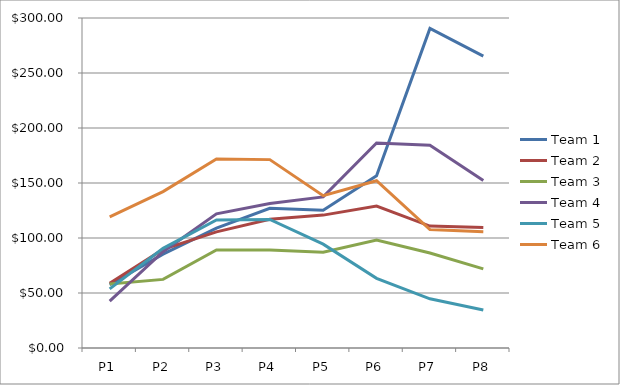
| Category | Team 1 | Team 2 | Team 3 | Team 4 | Team 5 | Team 6 |
|---|---|---|---|---|---|---|
| P1 | 57.47 | 58.85 | 58.15 | 42.57 | 53.76 | 119.25 |
| P2 | 85.32 | 89.62 | 62.39 | 87.53 | 90.62 | 142.2 |
| P3 | 108.97 | 105.54 | 89.13 | 121.99 | 116.46 | 171.77 |
| P4 | 126.97 | 117.07 | 89.02 | 131.38 | 116.87 | 171.25 |
| P5 | 125.25 | 120.8 | 87 | 137.35 | 94.44 | 138.5 |
| P6 | 156.49 | 128.99 | 98.16 | 186.42 | 63.33 | 152.09 |
| P7 | 290.57 | 110.85 | 86.36 | 184.37 | 44.72 | 107.68 |
| P8 | 265.34 | 109.44 | 71.88 | 152.37 | 34.48 | 105.63 |